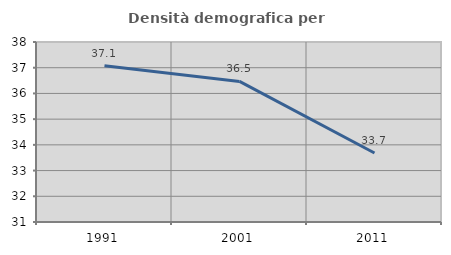
| Category | Densità demografica |
|---|---|
| 1991.0 | 37.08 |
| 2001.0 | 36.467 |
| 2011.0 | 33.684 |